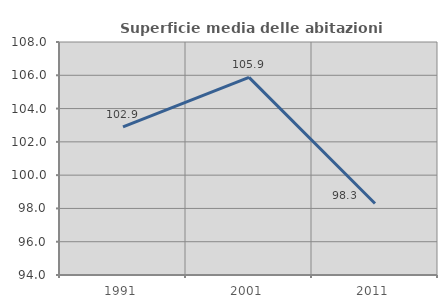
| Category | Superficie media delle abitazioni occupate |
|---|---|
| 1991.0 | 102.898 |
| 2001.0 | 105.873 |
| 2011.0 | 98.293 |